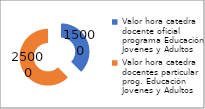
| Category | Series 0 |
|---|---|
| Valor hora catedra  docente oficial programa Educación Jovenes y Adultos | 15000 |
| Valor hora catedra docentes particular prog. Educación Jovenes y Adultos | 25000 |